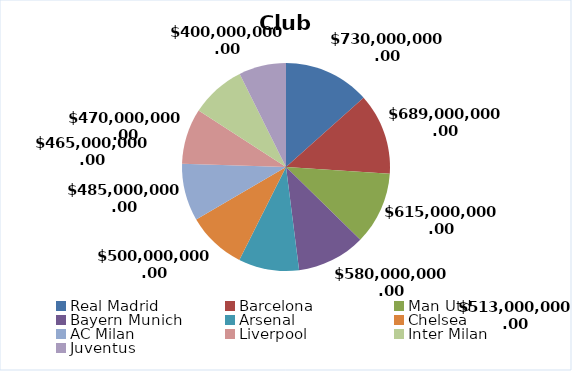
| Category | Value |
|---|---|
| Real Madrid | 730000000 |
| Barcelona | 689000000 |
| Man Utd | 615000000 |
| Bayern Munich | 580000000 |
| Arsenal | 513000000 |
| Chelsea | 500000000 |
| AC Milan | 485000000 |
| Liverpool | 470000000 |
| Inter Milan | 465000000 |
| Juventus | 400000000 |